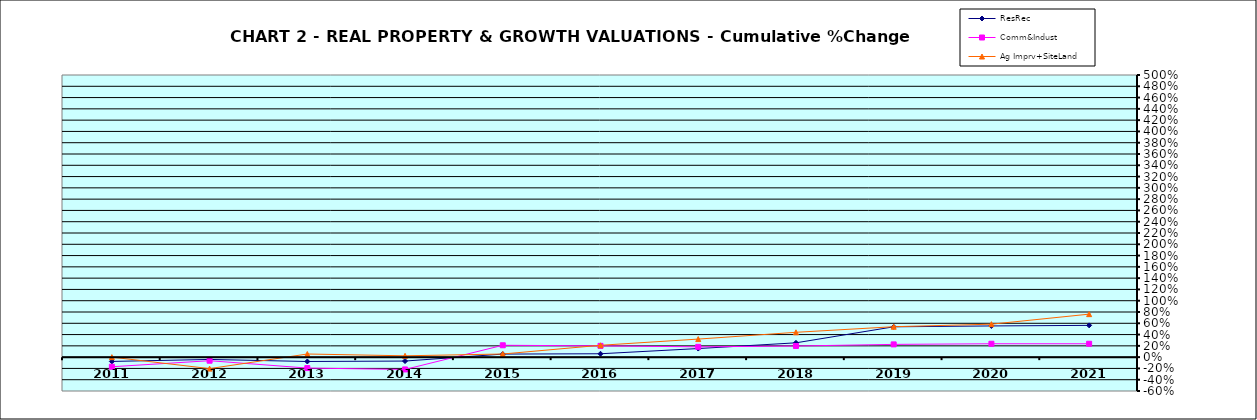
| Category | ResRec | Comm&Indust | Ag Imprv+SiteLand |
|---|---|---|---|
| 2011.0 | -0.076 | -0.17 | 0 |
| 2012.0 | -0.041 | -0.063 | -0.203 |
| 2013.0 | -0.077 | -0.194 | 0.055 |
| 2014.0 | -0.069 | -0.218 | 0.024 |
| 2015.0 | 0.054 | 0.21 | 0.055 |
| 2016.0 | 0.06 | 0.2 | 0.21 |
| 2017.0 | 0.152 | 0.183 | 0.32 |
| 2018.0 | 0.254 | 0.197 | 0.44 |
| 2019.0 | 0.538 | 0.226 | 0.539 |
| 2020.0 | 0.553 | 0.237 | 0.584 |
| 2021.0 | 0.563 | 0.237 | 0.762 |